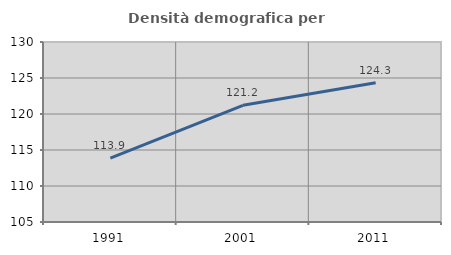
| Category | Densità demografica |
|---|---|
| 1991.0 | 113.883 |
| 2001.0 | 121.205 |
| 2011.0 | 124.335 |